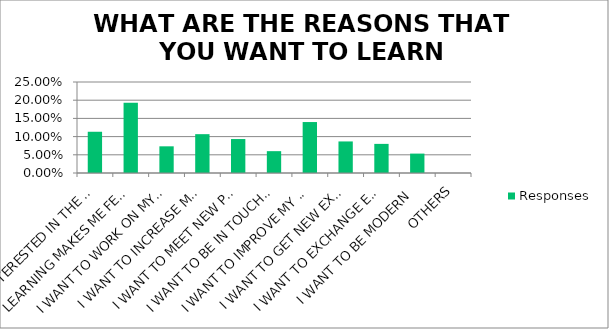
| Category | Responses |
|---|---|
| I'M INTERESTED IN THE TOPIC | 0.113 |
| LEARNING MAKES ME FEEL SATISFIED | 0.193 |
| I WANT TO WORK ON MYSELF | 0.073 |
| I WANT TO INCREASE MY SELF-CONFIDENCE | 0.107 |
| I WANT TO MEET NEW PEOPLE IRRESPECTIVE OF THEIR AGE | 0.093 |
| I WANT TO BE IN TOUCH WITH THE YOUNG GENERATION | 0.06 |
| I WANT TO IMPROVE MY MEMORY | 0.14 |
| I WANT TO GET NEW EXPERIENCES AND PRACTICE | 0.087 |
| I WANT TO EXCHANGE EXPERIENCE | 0.08 |
| I WANT TO BE MODERN | 0.053 |
| OTHERS | 0 |